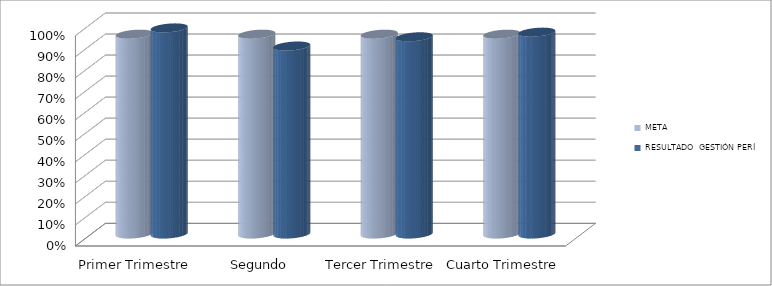
| Category | META | RESULTADO  GESTIÓN PERÍODO |
|---|---|---|
| Primer Trimestre | 0.95 | 0.98 |
| Segundo Trimestre | 0.95 | 0.894 |
| Tercer Trimestre | 0.95 | 0.938 |
| Cuarto Trimestre | 0.95 | 0.96 |